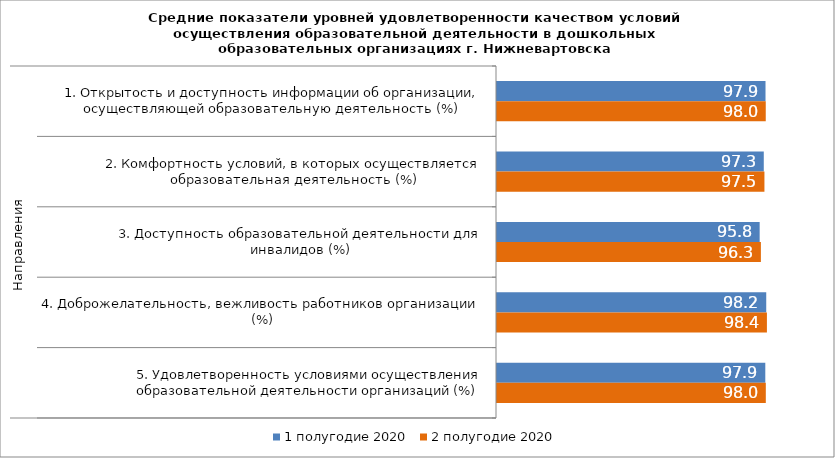
| Category | 1 полугодие 2020 | 2 полугодие 2020 |
|---|---|---|
| 0 | 97.937 | 98.025 |
| 1 | 97.306 | 97.545 |
| 2 | 95.806 | 96.253 |
| 3 | 98.201 | 98.448 |
| 4 | 97.86 | 98.047 |